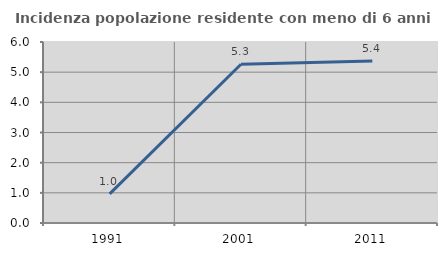
| Category | Incidenza popolazione residente con meno di 6 anni |
|---|---|
| 1991.0 | 0.966 |
| 2001.0 | 5.263 |
| 2011.0 | 5.369 |